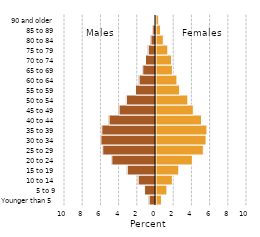
| Category | Series 0 |
|---|---|
| Younger than 5 | 0.6 |
| 5 to 9 | 1.2 |
| 10 to 14 | 1.8 |
| 15 to 19 | 2.5 |
| 20 to 24 | 4 |
| 25 to 29 | 5.2 |
| 30 to 34 | 5.5 |
| 35 to 39 | 5.6 |
| 40 to 44 | 5 |
| 45 to 49 | 4.1 |
| 50 to 54 | 3.5 |
| 55 to 59 | 2.6 |
| 60 to 64 | 2.3 |
| 65 to 69 | 1.8 |
| 70 to 74 | 1.7 |
| 75 to 79 | 1.3 |
| 80 to 84 | 0.8 |
| 85 to 89 | 0.5 |
| 90 and older | 0.3 |